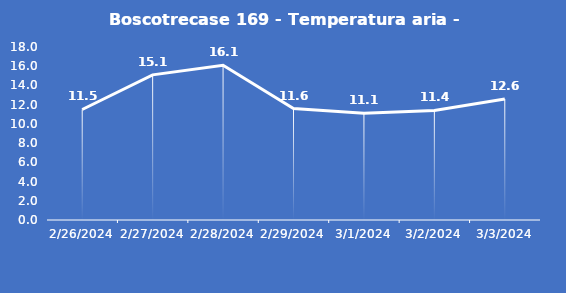
| Category | Boscotrecase 169 - Temperatura aria - Grezzo (°C) |
|---|---|
| 2/26/24 | 11.5 |
| 2/27/24 | 15.1 |
| 2/28/24 | 16.1 |
| 2/29/24 | 11.6 |
| 3/1/24 | 11.1 |
| 3/2/24 | 11.4 |
| 3/3/24 | 12.6 |